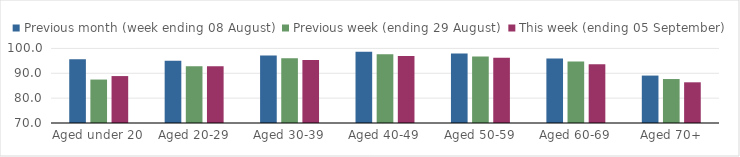
| Category | Previous month (week ending 08 August) | Previous week (ending 29 August) | This week (ending 05 September) |
|---|---|---|---|
| Aged under 20 | 95.6 | 87.48 | 88.88 |
| Aged 20-29 | 95.04 | 92.87 | 92.86 |
| Aged 30-39 | 97.18 | 96.08 | 95.36 |
| Aged 40-49 | 98.63 | 97.61 | 96.94 |
| Aged 50-59 | 97.96 | 96.75 | 96.28 |
| Aged 60-69 | 95.92 | 94.74 | 93.64 |
| Aged 70+ | 89.08 | 87.69 | 86.37 |